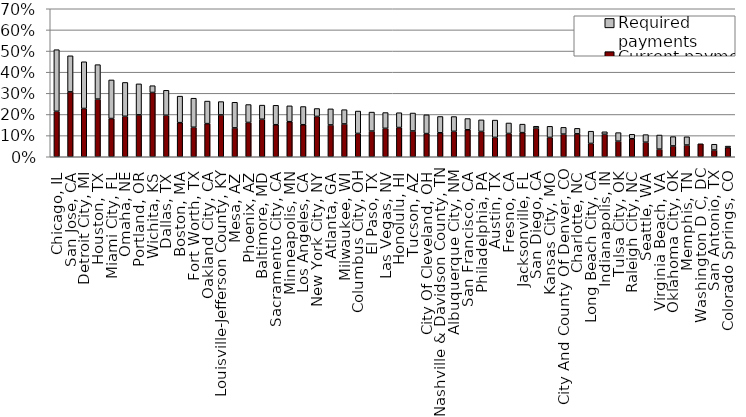
| Category | Current payments | Required payments |
|---|---|---|
| Chicago, IL | 0.215 | 0.291 |
| San Jose, CA | 0.307 | 0.171 |
| Detroit City, MI | 0.228 | 0.221 |
| Houston, TX | 0.273 | 0.163 |
| Miami City, FL | 0.181 | 0.183 |
| Omaha, NE | 0.191 | 0.16 |
| Portland, OR | 0.198 | 0.147 |
| Wichita, KS | 0.304 | 0.032 |
| Dallas, TX | 0.196 | 0.118 |
| Boston, MA | 0.161 | 0.125 |
| Fort Worth, TX | 0.14 | 0.137 |
| Oakland City, CA | 0.157 | 0.107 |
| Louisville-Jefferson County, KY | 0.198 | 0.063 |
| Mesa, AZ | 0.136 | 0.121 |
| Phoenix, AZ | 0.162 | 0.085 |
| Baltimore, MD | 0.177 | 0.067 |
| Sacramento City, CA | 0.152 | 0.092 |
| Minneapolis, MN | 0.166 | 0.075 |
| Los Angeles, CA | 0.152 | 0.086 |
| New York City, NY | 0.191 | 0.038 |
| Atlanta, GA | 0.15 | 0.076 |
| Milwaukee, WI | 0.155 | 0.068 |
| Columbus City, OH | 0.11 | 0.106 |
| El Paso, TX | 0.122 | 0.09 |
| Las Vegas, NV | 0.134 | 0.075 |
| Honolulu, HI | 0.138 | 0.07 |
| Tucson, AZ | 0.122 | 0.085 |
| City Of Cleveland, OH | 0.11 | 0.089 |
| Nashville & Davidson County, TN | 0.113 | 0.077 |
| Albuquerque City, NM | 0.12 | 0.07 |
| San Francisco, CA | 0.128 | 0.053 |
| Philadelphia, PA | 0.12 | 0.055 |
| Austin, TX | 0.092 | 0.082 |
| Fresno, CA | 0.11 | 0.05 |
| Jacksonville, FL | 0.114 | 0.04 |
| San Diego, CA | 0.135 | 0.009 |
| Kansas City, MO | 0.091 | 0.053 |
| City And County Of Denver, CO | 0.107 | 0.032 |
| Charlotte, NC | 0.108 | 0.026 |
| Long Beach City, CA | 0.063 | 0.058 |
| Indianapolis, IN | 0.106 | 0.012 |
| Tulsa City, OK | 0.074 | 0.04 |
| Raleigh City, NC | 0.085 | 0.021 |
| Seattle, WA | 0.069 | 0.036 |
| Virginia Beach, VA | 0.036 | 0.067 |
| Oklahoma City, OK | 0.051 | 0.044 |
| Memphis, TN | 0.055 | 0.039 |
| Washington D C, DC | 0.061 | 0 |
| San Antonio, TX | 0.032 | 0.027 |
| Colorado Springs, CO | 0.043 | 0.007 |